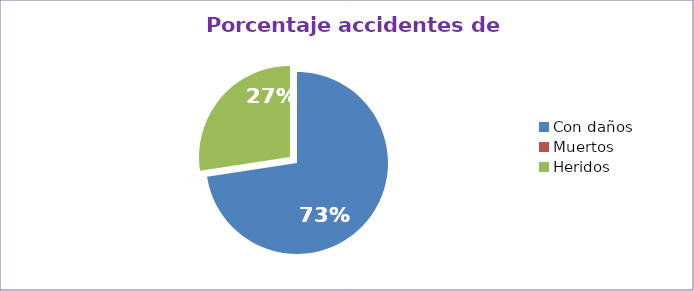
| Category | Series 0 |
|---|---|
| Con daños  | 72.581 |
| Muertos  | 0 |
| Heridos  | 27.419 |